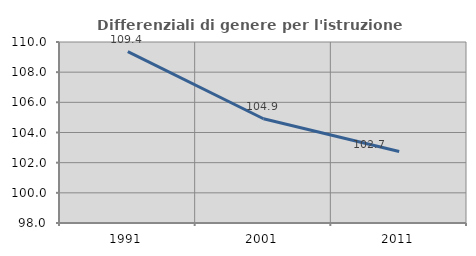
| Category | Differenziali di genere per l'istruzione superiore |
|---|---|
| 1991.0 | 109.363 |
| 2001.0 | 104.91 |
| 2011.0 | 102.742 |